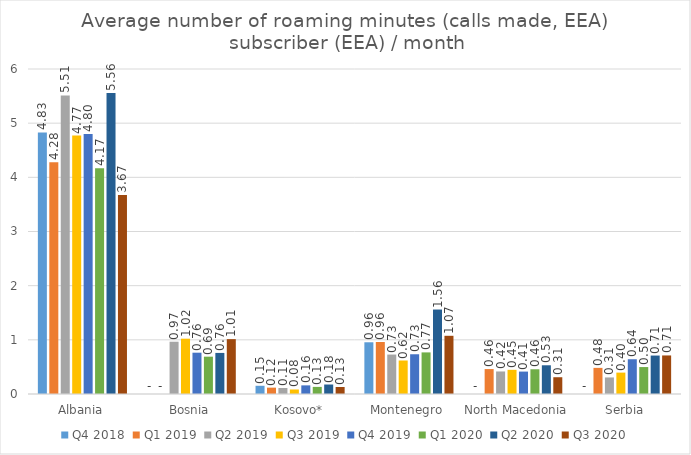
| Category | Q4 2018 | Q1 2019 | Q2 2019 | Q3 2019 | Q4 2019 | Q1 2020 | Q2 2020 | Q3 2020 |
|---|---|---|---|---|---|---|---|---|
| Albania | 4.83 | 4.277 | 5.511 | 4.771 | 4.799 | 4.167 | 5.556 | 3.673 |
| Bosnia | 0 | 0 | 0.965 | 1.021 | 0.763 | 0.689 | 0.758 | 1.013 |
| Kosovo* | 0.152 | 0.117 | 0.111 | 0.083 | 0.159 | 0.131 | 0.175 | 0.129 |
| Montenegro | 0.955 | 0.96 | 0.728 | 0.618 | 0.734 | 0.768 | 1.56 | 1.075 |
| North Macedonia | 0 | 0.46 | 0.416 | 0.446 | 0.414 | 0.457 | 0.53 | 0.31 |
| Serbia | 0 | 0.482 | 0.306 | 0.395 | 0.642 | 0.498 | 0.71 | 0.712 |